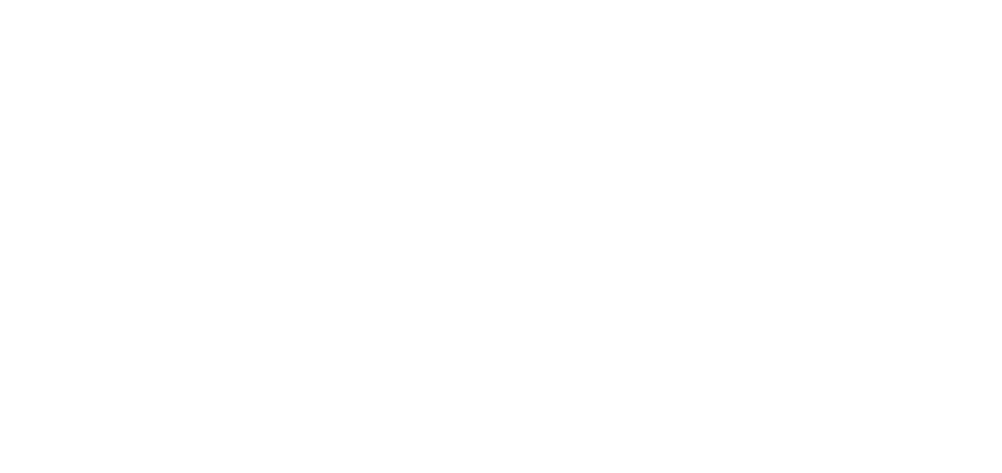
| Category | Total |
|---|---|
| Al Hodeidah | 542 |
| Hajjah | 512 |
| Marib | 197 |
| Taiz | 194 |
| Al Jawf | 163 |
| Amran | 148 |
| Hadramawt | 100 |
| Ad Dali | 95 |
| Lahj | 77 |
| Abyan | 65 |
| Ibb | 61 |
| Sanaa | 51 |
| Al Bayda | 35 |
| Aden | 33 |
| Sadah | 18 |
| Shabwah | 17 |
| Dhamar | 16 |
| Al Maharah | 12 |
| Al Mahwit | 9 |
| Raymah | 8 |
| Sanaa City | 4 |
| Socotra | 1 |